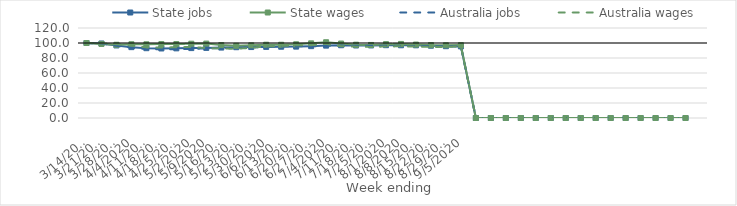
| Category | State jobs | State wages | Australia jobs | Australia wages |
|---|---|---|---|---|
| 14/03/2020 | 100 | 100 | 100 | 100 |
| 21/03/2020 | 99.322 | 98.785 | 99.287 | 99.672 |
| 28/03/2020 | 96.729 | 97.661 | 96.324 | 98.416 |
| 04/04/2020 | 94.462 | 98.337 | 93.668 | 96.718 |
| 11/04/2020 | 93.075 | 98.269 | 91.934 | 94.131 |
| 18/04/2020 | 92.694 | 98.526 | 91.469 | 94.023 |
| 25/04/2020 | 92.867 | 98.549 | 91.796 | 94.249 |
| 02/05/2020 | 93.203 | 99.052 | 92.192 | 94.719 |
| 09/05/2020 | 93.458 | 99.213 | 92.74 | 93.349 |
| 16/05/2020 | 93.908 | 97.244 | 93.27 | 92.686 |
| 23/05/2020 | 94.393 | 96.329 | 93.57 | 92.302 |
| 30/05/2020 | 94.596 | 96.906 | 94.082 | 93.6 |
| 06/06/2020 | 94.808 | 97.728 | 94.995 | 95.373 |
| 13/06/2020 | 95.034 | 97.68 | 95.458 | 96.064 |
| 20/06/2020 | 95.182 | 98.275 | 95.654 | 96.971 |
| 27/06/2020 | 95.8 | 99.526 | 95.59 | 97.092 |
| 04/07/2020 | 96.504 | 101.002 | 96.269 | 98.79 |
| 11/07/2020 | 97.006 | 99.289 | 96.518 | 95.694 |
| 18/07/2020 | 96.701 | 97.759 | 96.375 | 95.102 |
| 25/07/2020 | 96.735 | 97.416 | 96.44 | 94.758 |
| 01/08/2020 | 97.077 | 98.496 | 96.466 | 95.35 |
| 08/08/2020 | 96.979 | 98.764 | 96.196 | 95.604 |
| 15/08/2020 | 96.928 | 97.897 | 96.048 | 95.29 |
| 22/08/2020 | 96.388 | 97.193 | 95.872 | 94.881 |
| 29/08/2020 | 95.748 | 96.952 | 95.598 | 94.692 |
| 05/09/2020 | 95.496 | 97.187 | 95.533 | 95.73 |